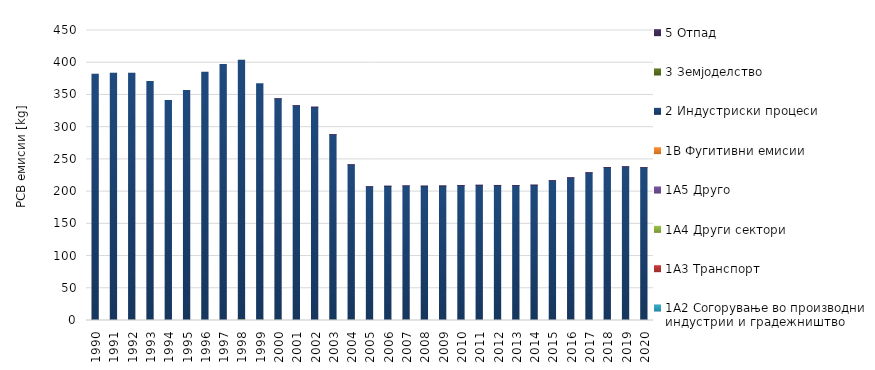
| Category | 1A1 | 1A2 | 1A3 | 1A4 | 1A5 | 1B | 2 | 3 | 5 |
|---|---|---|---|---|---|---|---|---|---|
| 1990 | 0 | 0.733 | 0 | 1.011 | 0 | 0 | 380.384 | 0 | 0 |
| 1991 | 0 | 0.698 | 0 | 0.908 | 0 | 0 | 381.942 | 0 | 0 |
| 1992 | 0 | 0.752 | 0 | 0.999 | 0 | 0 | 382.097 | 0 | 0 |
| 1993 | 0 | 0.669 | 0 | 1.091 | 0 | 0 | 369.044 | 0 | 0 |
| 1994 | 0 | 0.474 | 0 | 1.045 | 0 | 0 | 340.045 | 0 | 0 |
| 1995 | 0 | 0.644 | 0 | 1.043 | 0 | 0 | 355.05 | 0 | 0 |
| 1996 | 0 | 0.016 | 0 | 1.041 | 0 | 0 | 384.113 | 0 | 0 |
| 1997 | 0 | 0.312 | 0 | 1.04 | 0 | 0 | 395.855 | 0 | 0 |
| 1998 | 0 | 1.31 | 0 | 0.979 | 0 | 0 | 401.633 | 0 | 0 |
| 1999 | 0 | 0.977 | 0 | 1.112 | 0 | 0 | 365.36 | 0 | 0 |
| 2000 | 0 | 0.849 | 0 | 1.193 | 0 | 0 | 341.943 | 0 | 0.002 |
| 2001 | 0 | 0.764 | 0 | 0.924 | 0 | 0 | 331.563 | 0 | 0.005 |
| 2002 | 0 | 0.566 | 0 | 0.951 | 0 | 0 | 329.455 | 0 | 0.005 |
| 2003 | 0 | 0.779 | 0 | 1.06 | 0 | 0 | 286.533 | 0 | 0.005 |
| 2004 | 0 | 0.854 | 0 | 1.13 | 0 | 0 | 239.594 | 0 | 0.006 |
| 2005 | 0 | 0.961 | 0 | 0.58 | 0 | 0 | 205.98 | 0 | 0.008 |
| 2006 | 0 | 1.118 | 0 | 0.567 | 0 | 0 | 206.604 | 0 | 0.007 |
| 2007 | 0 | 1.3 | 0 | 0.538 | 0 | 0 | 207.058 | 0 | 0.007 |
| 2008 | 0 | 1.046 | 0 | 0.492 | 0 | 0 | 206.963 | 0 | 0.007 |
| 2009 | 0 | 0.67 | 0 | 0.495 | 0 | 0 | 207.376 | 0 | 0.008 |
| 2010 | 0 | 1.017 | 0 | 0.489 | 0 | 0 | 207.813 | 0 | 0.009 |
| 2011 | 0 | 0.939 | 0 | 0.527 | 0 | 0 | 208.255 | 0 | 0.012 |
| 2012 | 0 | 1.105 | 0 | 0.581 | 0 | 0 | 207.87 | 0 | 0.014 |
| 2013 | 0 | 0.913 | 0 | 0.588 | 0 | 0 | 207.867 | 0 | 0.015 |
| 2014 | 0 | 0.94 | 0 | 0.57 | 0 | 0 | 208.507 | 0 | 0.015 |
| 2015 | 0 | 0.902 | 0 | 0.596 | 0 | 0 | 215.395 | 0 | 0.019 |
| 2016 | 0 | 1.221 | 0 | 0.574 | 0 | 0 | 219.602 | 0 | 0.02 |
| 2017 | 0 | 0.876 | 0 | 0.486 | 0 | 0 | 227.774 | 0 | 0.021 |
| 2018 | 0 | 0.955 | 0 | 0.462 | 0 | 0 | 235.931 | 0 | 0.019 |
| 2019 | 0 | 1.063 | 0 | 0.486 | 0 | 0 | 236.881 | 0 | 0.02 |
| 2020 | 0 | 0.675 | 0 | 0.485 | 0 | 0 | 236.058 | 0 | 0.021 |